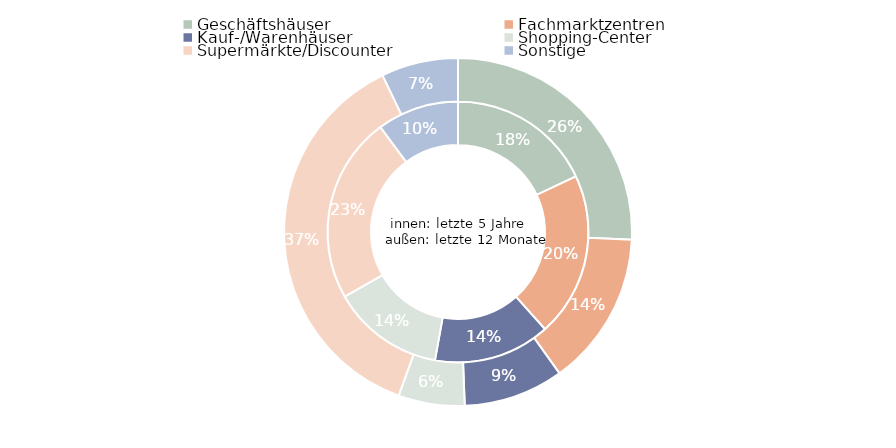
| Category | Series 1 | Series 0 |
|---|---|---|
| Geschäftshäuser | 1721379898.878 | 1430377418 |
| Fachmarktzentren | 1950312670.8 | 799733195 |
| Kauf-/Warenhäuser | 1382762996.952 | 517010584.99 |
| Shopping-Center | 1331977115.586 | 342270223 |
| Supermärkte/Discounter | 2211621374.948 | 2075863472.3 |
| Sonstige | 968976970.662 | 397532014 |